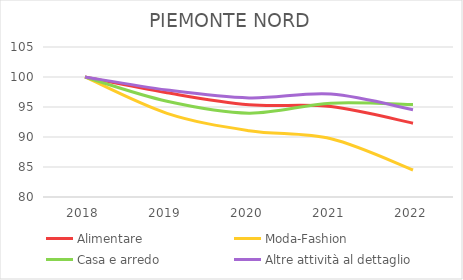
| Category | Alimentare | Moda-Fashion | Casa e arredo | Altre attività al dettaglio |
|---|---|---|---|---|
| 2018.0 | 100 | 100 | 100 | 100 |
| 2019.0 | 97.375 | 93.947 | 95.959 | 97.836 |
| 2020.0 | 95.377 | 91.054 | 93.978 | 96.519 |
| 2021.0 | 95.079 | 89.696 | 95.642 | 97.151 |
| 2022.0 | 92.305 | 84.5 | 95.404 | 94.554 |